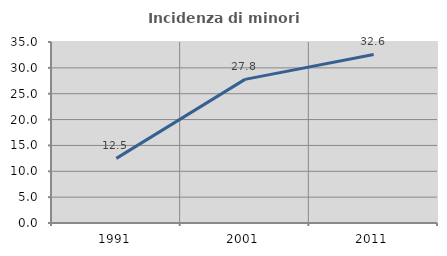
| Category | Incidenza di minori stranieri |
|---|---|
| 1991.0 | 12.5 |
| 2001.0 | 27.778 |
| 2011.0 | 32.591 |